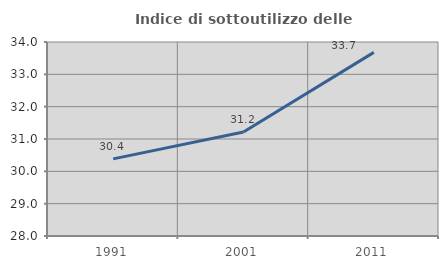
| Category | Indice di sottoutilizzo delle abitazioni  |
|---|---|
| 1991.0 | 30.386 |
| 2001.0 | 31.215 |
| 2011.0 | 33.679 |